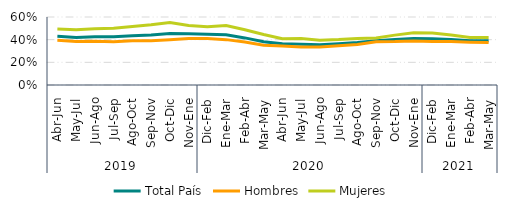
| Category | Total País | Hombres | Mujeres |
|---|---|---|---|
| 0 | 0.43 | 0.396 | 0.493 |
| 1 | 0.42 | 0.383 | 0.487 |
| 2 | 0.426 | 0.386 | 0.497 |
| 3 | 0.425 | 0.382 | 0.501 |
| 4 | 0.435 | 0.39 | 0.516 |
| 5 | 0.44 | 0.39 | 0.531 |
| 6 | 0.454 | 0.399 | 0.551 |
| 7 | 0.452 | 0.411 | 0.525 |
| 8 | 0.447 | 0.409 | 0.513 |
| 9 | 0.444 | 0.4 | 0.525 |
| 10 | 0.416 | 0.379 | 0.487 |
| 11 | 0.382 | 0.352 | 0.445 |
| 12 | 0.364 | 0.344 | 0.408 |
| 13 | 0.359 | 0.336 | 0.409 |
| 14 | 0.354 | 0.335 | 0.396 |
| 15 | 0.364 | 0.347 | 0.401 |
| 16 | 0.375 | 0.358 | 0.411 |
| 17 | 0.391 | 0.381 | 0.414 |
| 18 | 0.4 | 0.383 | 0.44 |
| 19 | 0.411 | 0.389 | 0.461 |
| 20 | 0.408 | 0.384 | 0.46 |
| 21 | 0.402 | 0.384 | 0.441 |
| 22 | 0.391 | 0.378 | 0.42 |
| 23 | 0.39 | 0.376 | 0.419 |